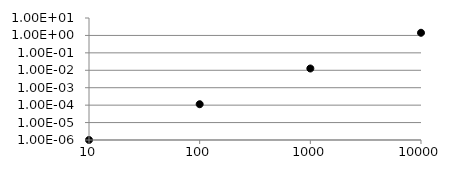
| Category | Series 0 |
|---|---|
| 10.0 | 0 |
| 100.0 | 0 |
| 1000.0 | 0.013 |
| 10000.0 | 1.422 |